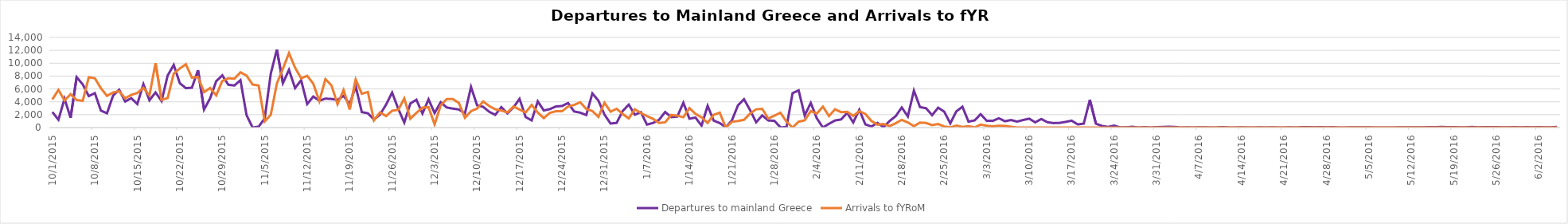
| Category | Departures to mainland Greece | Arrivals to fYRoM |
|---|---|---|
| 10/1/15 | 2409 | 4370 |
| 10/2/15 | 1215 | 5853 |
| 10/3/15 | 4480 | 4202 |
| 10/4/15 | 1513 | 5181 |
| 10/5/15 | 7833 | 4282 |
| 10/6/15 | 6707 | 4156 |
| 10/7/15 | 4886 | 7816 |
| 10/8/15 | 5349 | 7663 |
| 10/9/15 | 2631 | 6107 |
| 10/10/15 | 2214 | 4922 |
| 10/11/15 | 4950 | 5448 |
| 10/12/15 | 5879 | 5645 |
| 10/13/15 | 4052 | 4551 |
| 10/14/15 | 4564 | 5073 |
| 10/15/15 | 3660 | 5373 |
| 10/16/15 | 6743 | 6181 |
| 10/17/15 | 4239 | 4988 |
| 10/18/15 | 5457 | 10005 |
| 10/19/15 | 4119 | 4299 |
| 10/20/15 | 8083 | 4584 |
| 10/21/15 | 9725 | 8384 |
| 10/22/15 | 6896 | 9174 |
| 10/23/15 | 6120 | 9840 |
| 10/24/15 | 6195 | 7752 |
| 10/25/15 | 8916 | 7864 |
| 10/26/15 | 2804 | 5500 |
| 10/27/15 | 4540 | 6146 |
| 10/28/15 | 7191 | 5000 |
| 10/29/15 | 8117 | 7231 |
| 10/30/15 | 6649 | 7663 |
| 10/31/15 | 6537 | 7590 |
| 11/1/15 | 7360 | 8584 |
| 11/2/15 | 1935 | 8075 |
| 11/3/15 | 0 | 6682 |
| 11/4/15 | 142 | 6532 |
| 11/5/15 | 1430 | 960 |
| 11/6/15 | 8392 | 1987 |
| 11/7/15 | 12116 | 6847 |
| 11/8/15 | 6902 | 9148 |
| 11/9/15 | 8977 | 11572 |
| 11/10/15 | 6133 | 9305 |
| 11/11/15 | 7354 | 7651 |
| 11/12/15 | 3650 | 8038 |
| 11/13/15 | 4820 | 6826 |
| 11/14/15 | 4171 | 4107 |
| 11/15/15 | 4497 | 7511 |
| 11/16/15 | 4442 | 6557 |
| 11/17/15 | 4289 | 3621 |
| 11/18/15 | 4927 | 5831 |
| 11/19/15 | 3644 | 2816 |
| 11/20/15 | 6389 | 7453 |
| 11/21/15 | 2401 | 5255 |
| 11/22/15 | 2214 | 5539 |
| 11/23/15 | 1245 | 1113 |
| 11/24/15 | 2006 | 2347 |
| 11/25/15 | 3565 | 1779 |
| 11/26/15 | 5435 | 2617 |
| 11/27/15 | 2932 | 2744 |
| 11/28/15 | 778 | 4520 |
| 11/29/15 | 3736 | 1373 |
| 11/30/15 | 4318 | 2270 |
| 12/1/15 | 2181 | 3094 |
| 12/2/15 | 4384 | 3174 |
| 12/3/15 | 2255 | 494 |
| 12/4/15 | 3934 | 3436 |
| 12/5/15 | 3115 | 4430 |
| 12/6/15 | 2943 | 4425 |
| 12/7/15 | 2810 | 3826 |
| 12/8/15 | 2189 | 1508 |
| 12/9/15 | 6316 | 2550 |
| 12/10/15 | 3456 | 2956 |
| 12/11/15 | 3219 | 4047 |
| 12/12/15 | 2453 | 3338 |
| 12/13/15 | 1976 | 2849 |
| 12/14/15 | 3175 | 2644 |
| 12/15/15 | 2191 | 2349 |
| 12/16/15 | 3137 | 3264 |
| 12/17/15 | 4461 | 2801 |
| 12/18/15 | 1638 | 2332 |
| 12/19/15 | 1110 | 3515 |
| 12/20/15 | 4070 | 2338 |
| 12/21/15 | 2652 | 1470 |
| 12/22/15 | 2864 | 2272 |
| 12/23/15 | 3278 | 2529 |
| 12/24/15 | 3349 | 2529 |
| 12/25/15 | 3806 | 3268 |
| 12/26/15 | 2498 | 3521 |
| 12/27/15 | 2311 | 3938 |
| 12/28/15 | 1946 | 2884 |
| 12/29/15 | 5309 | 2577 |
| 12/30/15 | 4178 | 1665 |
| 12/31/15 | 2009 | 3848 |
| 1/1/16 | 623 | 2454 |
| 1/2/16 | 720 | 2918 |
| 1/3/16 | 2569 | 2112 |
| 1/4/16 | 3563 | 1415 |
| 1/5/16 | 1998 | 2842 |
| 1/6/16 | 2377 | 2258 |
| 1/7/16 | 463 | 1776 |
| 1/8/16 | 716 | 1344 |
| 1/9/16 | 1203 | 715 |
| 1/10/16 | 2417 | 819 |
| 1/11/16 | 1621 | 1959 |
| 1/12/16 | 1701 | 1840 |
| 1/13/16 | 3861 | 1600 |
| 1/14/16 | 1378 | 3022 |
| 1/15/16 | 1551 | 2119 |
| 1/16/16 | 301 | 1598 |
| 1/17/16 | 3378 | 720 |
| 1/18/16 | 1078 | 1980 |
| 1/19/16 | 695 | 2298 |
| 1/20/16 | 50 | 0 |
| 1/21/16 | 1108 | 892 |
| 1/22/16 | 3451 | 1030 |
| 1/23/16 | 4397 | 1208 |
| 1/24/16 | 2706 | 2174 |
| 1/25/16 | 819 | 2836 |
| 1/26/16 | 1887 | 2908 |
| 1/27/16 | 1098 | 1402 |
| 1/28/16 | 1046 | 1837 |
| 1/29/16 | 40 | 2292 |
| 1/30/16 | 53 | 931 |
| 1/31/16 | 5342 | 0 |
| 2/1/16 | 5783 | 908 |
| 2/2/16 | 1878 | 1121 |
| 2/3/16 | 3829 | 2558 |
| 2/4/16 | 1436 | 2173 |
| 2/5/16 | 0 | 3259 |
| 2/6/16 | 578 | 1780 |
| 2/7/16 | 1097 | 2838 |
| 2/8/16 | 1259 | 2392 |
| 2/9/16 | 2283 | 2441 |
| 2/10/16 | 793 | 1817 |
| 2/11/16 | 2756 | 2540 |
| 2/12/16 | 496 | 2115 |
| 2/13/16 | 161 | 1019 |
| 2/14/16 | 724 | 452 |
| 2/15/16 | 65 | 542 |
| 2/16/16 | 1024 | 234 |
| 2/17/16 | 1772 | 668 |
| 2/18/16 | 3118 | 1200 |
| 2/19/16 | 1731 | 799 |
| 2/20/16 | 5738 | 209 |
| 2/21/16 | 3180 | 774 |
| 2/22/16 | 3002 | 714 |
| 2/23/16 | 1927 | 382 |
| 2/24/16 | 3086 | 551 |
| 2/25/16 | 2468 | 168 |
| 2/26/16 | 649 | 20 |
| 2/27/16 | 2525 | 310 |
| 2/28/16 | 3234 | 92 |
| 2/29/16 | 920 | 208 |
| 3/1/16 | 1107 | 30 |
| 3/2/16 | 2073 | 457 |
| 3/3/16 | 1061 | 269 |
| 3/4/16 | 1035 | 177 |
| 3/5/16 | 1444 | 293 |
| 3/6/16 | 980 | 261 |
| 3/7/16 | 1171 | 127 |
| 3/8/16 | 922 | 0 |
| 3/9/16 | 1169 | 0 |
| 3/10/16 | 1381 | 0 |
| 3/11/16 | 810 | 0 |
| 3/12/16 | 1326 | 0 |
| 3/13/16 | 831 | 0 |
| 3/14/16 | 693 | 0 |
| 3/15/16 | 721 | 0 |
| 3/16/16 | 882 | 0 |
| 3/17/16 | 1068 | 0 |
| 3/18/16 | 489 | 0 |
| 3/19/16 | 608 | 0 |
| 3/20/16 | 4314 | 0 |
| 3/21/16 | 616 | 0 |
| 3/22/16 | 254 | 0 |
| 3/23/16 | 95 | 0 |
| 3/24/16 | 316 | 0 |
| 3/25/16 | 22 | 0 |
| 3/26/16 | 25 | 0 |
| 3/27/16 | 113 | 0 |
| 3/28/16 | 0 | 0 |
| 3/29/16 | 76 | 0 |
| 3/30/16 | 11 | 0 |
| 3/31/16 | 68 | 0 |
| 4/1/16 | 102 | 0 |
| 4/2/16 | 132 | 0 |
| 4/3/16 | 105 | 0 |
| 4/4/16 | 0 | 0 |
| 4/5/16 | 31 | 0 |
| 4/6/16 | 7 | 0 |
| 4/7/16 | 32 | 0 |
| 4/8/16 | 17 | 0 |
| 4/9/16 | 14 | 0 |
| 4/10/16 | 16 | 0 |
| 4/11/16 | 64 | 0 |
| 4/12/16 | 5 | 0 |
| 4/13/16 | 10 | 0 |
| 4/14/16 | 36 | 0 |
| 4/15/16 | 0 | 0 |
| 4/16/16 | 0 | 0 |
| 4/17/16 | 34 | 0 |
| 4/18/16 | 9 | 0 |
| 4/19/16 | 39 | 0 |
| 4/20/16 | 7 | 0 |
| 4/21/16 | 7 | 0 |
| 4/22/16 | 16 | 0 |
| 4/23/16 | 0 | 0 |
| 4/24/16 | 51 | 0 |
| 4/25/16 | 54 | 0 |
| 4/26/16 | 17 | 0 |
| 4/27/16 | 52 | 0 |
| 4/28/16 | 16 | 0 |
| 4/29/16 | 56 | 0 |
| 4/30/16 | 4 | 0 |
| 5/1/16 | 0 | 0 |
| 5/2/16 | 25 | 0 |
| 5/3/16 | 34 | 0 |
| 5/4/16 | 41 | 0 |
| 5/5/16 | 37 | 0 |
| 5/6/16 | 1 | 0 |
| 5/7/16 | 0 | 0 |
| 5/8/16 | 0 | 0 |
| 5/9/16 | 5 | 0 |
| 5/10/16 | 46 | 0 |
| 5/11/16 | 40 | 0 |
| 5/12/16 | 39 | 0 |
| 5/13/16 | 31 | 0 |
| 5/14/16 | 22 | 0 |
| 5/15/16 | 75 | 0 |
| 5/16/16 | 51 | 0 |
| 5/17/16 | 88 | 0 |
| 5/18/16 | 64 | 0 |
| 5/19/16 | 62 | 0 |
| 5/20/16 | 39 | 0 |
| 5/21/16 | 31 | 0 |
| 5/22/16 | 93 | 0 |
| 5/23/16 | 27 | 0 |
| 5/24/16 | 48 | 0 |
| 5/25/16 | 70 | 0 |
| 5/26/16 | 60 | 0 |
| 5/27/16 | 31 | 0 |
| 5/28/16 | 31 | 0 |
| 5/29/16 | 62 | 0 |
| 5/30/16 | 35 | 0 |
| 5/31/16 | 57 | 0 |
| 6/1/16 | 36 | 0 |
| 6/2/16 | 57 | 0 |
| 6/3/16 | 29 | 0 |
| 6/4/16 | 28 | 0 |
| 6/5/16 | 99 | 0 |